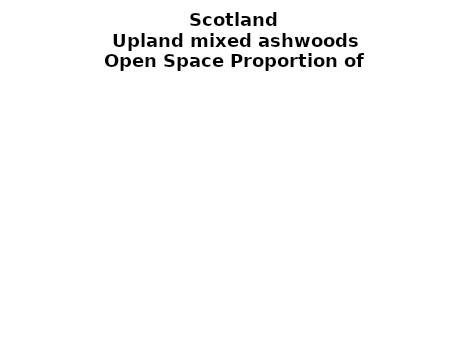
| Category | Upland mixed ashwoods |
|---|---|
|  ≥ 10ha, < 10%  | 0.166 |
|   ≥ 10ha, 10-25% | 0.135 |
|   ≥ 10ha, > 25 and <50%  | 0.128 |
|   ≥ 10ha, ≥ 50%  | 0.272 |
|  < 10ha, < 10% | 0.036 |
|  < 10ha, 10-25% | 0.058 |
|  < 10ha, > 25 and < 50% | 0.043 |
|  < 10ha, ≥ 50% | 0.162 |